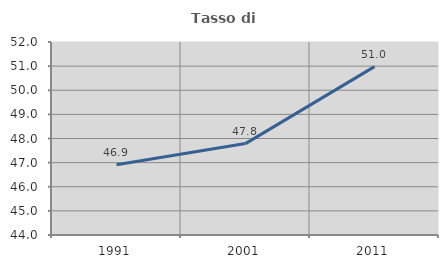
| Category | Tasso di occupazione   |
|---|---|
| 1991.0 | 46.909 |
| 2001.0 | 47.789 |
| 2011.0 | 50.978 |